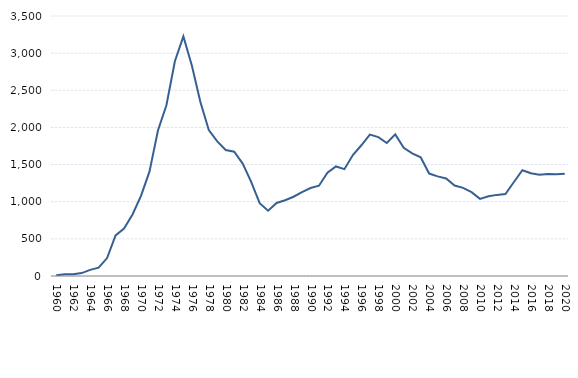
| Category | Series 1 |
|---|---|
| 1960.0 | 9 |
| 1961.0 | 24 |
| 1962.0 | 24 |
| 1963.0 | 39 |
| 1964.0 | 82 |
| 1965.0 | 113 |
| 1966.0 | 241 |
| 1967.0 | 546 |
| 1968.0 | 638 |
| 1969.0 | 829 |
| 1970.0 | 1078 |
| 1971.0 | 1404 |
| 1972.0 | 1958 |
| 1973.0 | 2299 |
| 1974.0 | 2891 |
| 1975.0 | 3226 |
| 1976.0 | 2835 |
| 1977.0 | 2346 |
| 1978.0 | 1964 |
| 1979.0 | 1812 |
| 1980.0 | 1696 |
| 1981.0 | 1673 |
| 1982.0 | 1513 |
| 1983.0 | 1266 |
| 1984.0 | 980 |
| 1985.0 | 880 |
| 1986.0 | 983 |
| 1987.0 | 1020 |
| 1988.0 | 1067 |
| 1989.0 | 1130 |
| 1990.0 | 1184 |
| 1991.0 | 1215 |
| 1992.0 | 1390 |
| 1993.0 | 1475 |
| 1994.0 | 1438 |
| 1995.0 | 1628 |
| 1996.0 | 1760 |
| 1997.0 | 1903 |
| 1998.0 | 1870 |
| 1999.0 | 1790 |
| 2000.0 | 1906 |
| 2001.0 | 1725 |
| 2002.0 | 1650 |
| 2003.0 | 1599 |
| 2004.0 | 1379 |
| 2005.0 | 1341 |
| 2006.0 | 1312 |
| 2007.0 | 1218 |
| 2008.0 | 1187 |
| 2009.0 | 1128 |
| 2010.0 | 1038 |
| 2011.0 | 1073 |
| 2012.0 | 1092 |
| 2013.0 | 1103 |
| 2014.0 | 1265 |
| 2015.0 | 1424 |
| 2016.0 | 1383 |
| 2017.0 | 1364 |
| 2018.0 | 1374 |
| 2019.0 | 1370 |
| 2020.0 | 1378 |